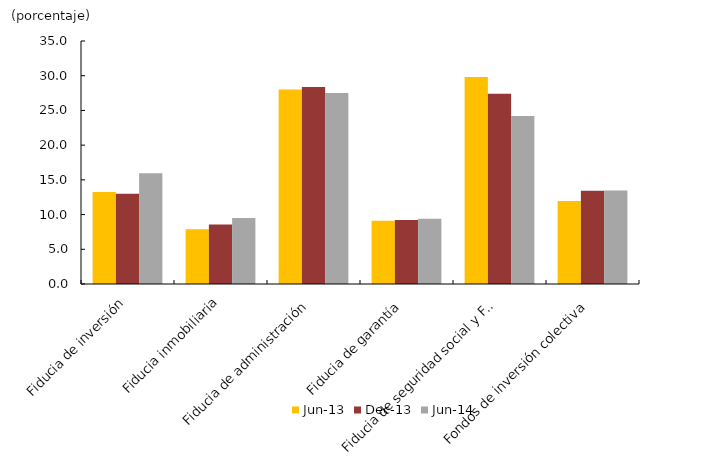
| Category | jun-13 | dic-13 | jun-14 |
|---|---|---|---|
| Fiducia de inversión | 13.238 | 13.007 | 15.943 |
| Fiducia inmobiliaria | 7.881 | 8.587 | 9.499 |
| Fiducia de administración | 28.021 | 28.357 | 27.497 |
| Fiducia de garantía | 9.102 | 9.202 | 9.387 |
| Fiducia de seguridad social y FPV | 29.806 | 27.417 | 24.196 |
| Fondos de inversión colectiva | 11.952 | 13.431 | 13.478 |